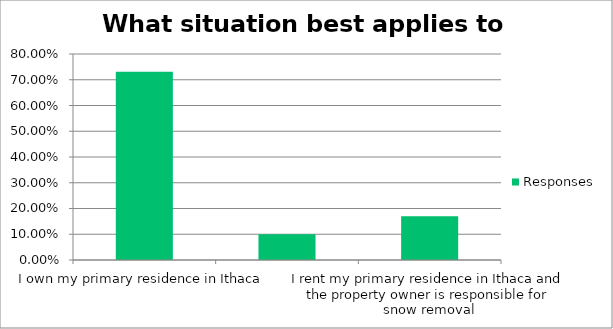
| Category | Responses |
|---|---|
| I own my primary residence in Ithaca | 0.731 |
| I rent my primary residence in Ithaca and I am responsible for snow removal | 0.1 |
| I rent my primary residence in Ithaca and the property owner is responsible for snow removal | 0.17 |